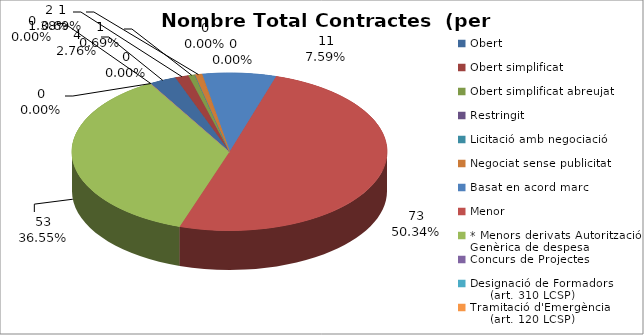
| Category | Nombre Total Contractes |
|---|---|
| Obert | 4 |
| Obert simplificat | 2 |
| Obert simplificat abreujat | 1 |
| Restringit | 0 |
| Licitació amb negociació | 0 |
| Negociat sense publicitat | 1 |
| Basat en acord marc | 11 |
| Menor | 73 |
| * Menors derivats Autorització Genèrica de despesa | 53 |
| Concurs de Projectes | 0 |
| Designació de Formadors
     (art. 310 LCSP) | 0 |
| Tramitació d'Emergència
     (art. 120 LCSP) | 0 |